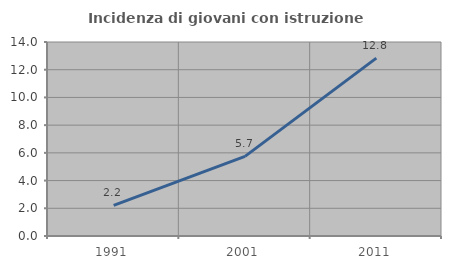
| Category | Incidenza di giovani con istruzione universitaria |
|---|---|
| 1991.0 | 2.206 |
| 2001.0 | 5.746 |
| 2011.0 | 12.837 |